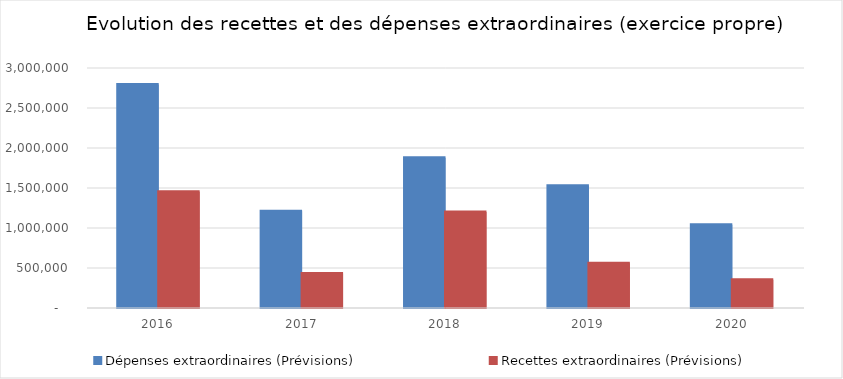
| Category | Dépenses extraordinaires (Prévisions) | Recettes extraordinaires (Prévisions) |
|---|---|---|
| 2016.0 | 2792378.71 | 1452461.83 |
| 2017.0 | 1209590.98 | 432344.56 |
| 2018.0 | 1877699.64 | 1198643.56 |
| 2019.0 | 1529478.39 | 560000 |
| 2020.0 | 1039770.05 | 351913.38 |